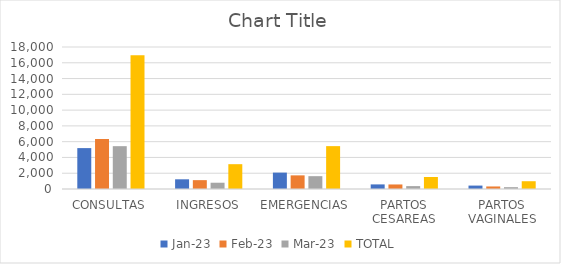
| Category | ene-23 | feb-23 | mar-23 | TOTAL |
|---|---|---|---|---|
| CONSULTAS | 5184 | 6340 | 5430 | 16954 |
| INGRESOS | 1229 | 1122 | 795 | 3146 |
| EMERGENCIAS | 2079 | 1728 | 1627 | 5434 |
| PARTOS CESAREAS | 583 | 575 | 366 | 1524 |
| PARTOS VAGINALES | 433 | 322 | 231 | 986 |